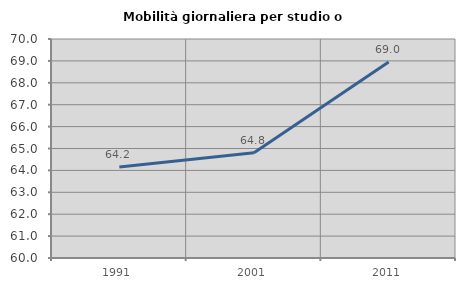
| Category | Mobilità giornaliera per studio o lavoro |
|---|---|
| 1991.0 | 64.153 |
| 2001.0 | 64.804 |
| 2011.0 | 68.95 |